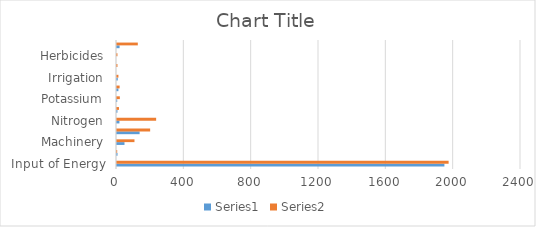
| Category | Series 0 | Series 1 |
|---|---|---|
| Input of Energy | 1945 | 1970 |
| Labor | 3.1 | 1.2 |
| Machinery | 44.5 | 103.8 |
| Gasoline | 134.3 | 196.9 |
| Nitrogen | 14.5 | 232.5 |
| Phosphorus | 2.6 | 11.7 |
| Potassium | 1.3 | 16.8 |
| Seeds | 8.4 | 15.6 |
| Irrigation | 4.7 | 8.4 |
| Insecticides | 0 | 2.7 |
| Herbicides | 0 | 2.7 |
| Other | 15.3 | 123.6 |